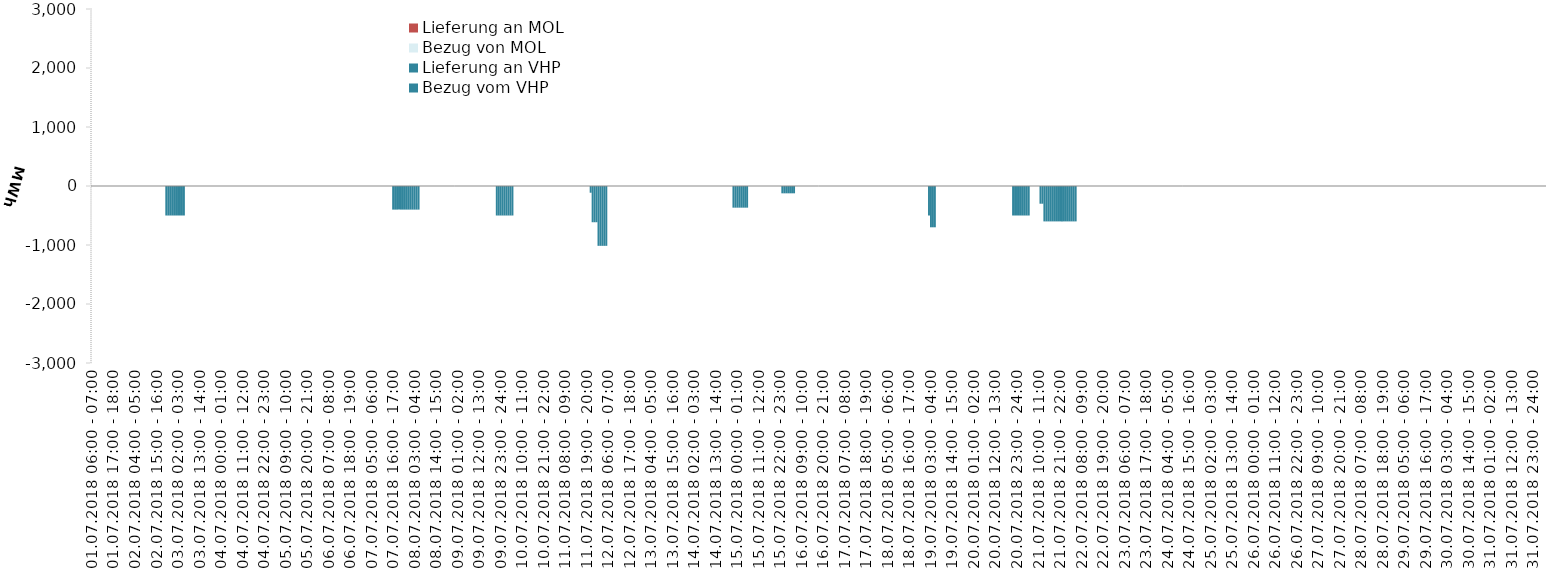
| Category | Bezug vom VHP | Lieferung an VHP | Bezug von MOL | Lieferung an MOL |
|---|---|---|---|---|
| 01.07.2018 06:00 - 07:00 | 0 | 0 | 0 | 0 |
| 01.07.2018 07:00 - 08:00 | 0 | 0 | 0 | 0 |
| 01.07.2018 08:00 - 09:00 | 0 | 0 | 0 | 0 |
| 01.07.2018 09:00 - 10:00 | 0 | 0 | 0 | 0 |
| 01.07.2018 10:00 - 11:00 | 0 | 0 | 0 | 0 |
| 01.07.2018 11:00 - 12:00 | 0 | 0 | 0 | 0 |
| 01.07.2018 12:00 - 13:00 | 0 | 0 | 0 | 0 |
| 01.07.2018 13:00 - 14:00 | 0 | 0 | 0 | 0 |
| 01.07.2018 14:00 - 15:00 | 0 | 0 | 0 | 0 |
| 01.07.2018 15:00 - 16:00 | 0 | 0 | 0 | 0 |
| 01.07.2018 16:00 - 17:00 | 0 | 0 | 0 | 0 |
| 01.07.2018 17:00 - 18:00 | 0 | 0 | 0 | 0 |
| 01.07.2018 18:00 - 19:00 | 0 | 0 | 0 | 0 |
| 01.07.2018 19:00 - 20:00 | 0 | 0 | 0 | 0 |
| 01.07.2018 20:00 - 21:00 | 0 | 0 | 0 | 0 |
| 01.07.2018 21:00 - 22:00 | 0 | 0 | 0 | 0 |
| 01.07.2018 22:00 - 23:00 | 0 | 0 | 0 | 0 |
| 01.07.2018 23:00 - 24:00 | 0 | 0 | 0 | 0 |
| 02.07.2018 00:00 - 01:00 | 0 | 0 | 0 | 0 |
| 02.07.2018 01:00 - 02:00 | 0 | 0 | 0 | 0 |
| 02.07.2018 02:00 - 03:00 | 0 | 0 | 0 | 0 |
| 02.07.2018 03:00 - 04:00 | 0 | 0 | 0 | 0 |
| 02.07.2018 04:00 - 05:00 | 0 | 0 | 0 | 0 |
| 02.07.2018 05:00 - 06:00 | 0 | 0 | 0 | 0 |
| 02.07.2018 06:00 - 07:00 | 0 | 0 | 0 | 0 |
| 02.07.2018 07:00 - 08:00 | 0 | 0 | 0 | 0 |
| 02.07.2018 08:00 - 09:00 | 0 | 0 | 0 | 0 |
| 02.07.2018 09:00 - 10:00 | 0 | 0 | 0 | 0 |
| 02.07.2018 10:00 - 11:00 | 0 | 0 | 0 | 0 |
| 02.07.2018 11:00 - 12:00 | 0 | 0 | 0 | 0 |
| 02.07.2018 12:00 - 13:00 | 0 | 0 | 0 | 0 |
| 02.07.2018 13:00 - 14:00 | 0 | 0 | 0 | 0 |
| 02.07.2018 14:00 - 15:00 | 0 | 0 | 0 | 0 |
| 02.07.2018 15:00 - 16:00 | 0 | 0 | 0 | 0 |
| 02.07.2018 16:00 - 17:00 | 0 | 0 | 0 | 0 |
| 02.07.2018 17:00 - 18:00 | 0 | 0 | 0 | 0 |
| 02.07.2018 18:00 - 19:00 | 0 | 0 | 0 | 0 |
| 02.07.2018 19:00 - 20:00 | 0 | 0 | 0 | 0 |
| 02.07.2018 20:00 - 21:00 | 0 | -500 | 0 | 0 |
| 02.07.2018 21:00 - 22:00 | 0 | -500 | 0 | 0 |
| 02.07.2018 22:00 - 23:00 | 0 | -500 | 0 | 0 |
| 02.07.2018 23:00 - 24:00 | 0 | -500 | 0 | 0 |
| 03.07.2018 00:00 - 01:00 | 0 | -500 | 0 | 0 |
| 03.07.2018 01:00 - 02:00 | 0 | -500 | 0 | 0 |
| 03.07.2018 02:00 - 03:00 | 0 | -500 | 0 | 0 |
| 03.07.2018 03:00 - 04:00 | 0 | -500 | 0 | 0 |
| 03.07.2018 04:00 - 05:00 | 0 | -500 | 0 | 0 |
| 03.07.2018 05:00 - 06:00 | 0 | -500 | 0 | 0 |
| 03.07.2018 06:00 - 07:00 | 0 | 0 | 0 | 0 |
| 03.07.2018 07:00 - 08:00 | 0 | 0 | 0 | 0 |
| 03.07.2018 08:00 - 09:00 | 0 | 0 | 0 | 0 |
| 03.07.2018 09:00 - 10:00 | 0 | 0 | 0 | 0 |
| 03.07.2018 10:00 - 11:00 | 0 | 0 | 0 | 0 |
| 03.07.2018 11:00 - 12:00 | 0 | 0 | 0 | 0 |
| 03.07.2018 12:00 - 13:00 | 0 | 0 | 0 | 0 |
| 03.07.2018 13:00 - 14:00 | 0 | 0 | 0 | 0 |
| 03.07.2018 14:00 - 15:00 | 0 | 0 | 0 | 0 |
| 03.07.2018 15:00 - 16:00 | 0 | 0 | 0 | 0 |
| 03.07.2018 16:00 - 17:00 | 0 | 0 | 0 | 0 |
| 03.07.2018 17:00 - 18:00 | 0 | 0 | 0 | 0 |
| 03.07.2018 18:00 - 19:00 | 0 | 0 | 0 | 0 |
| 03.07.2018 19:00 - 20:00 | 0 | 0 | 0 | 0 |
| 03.07.2018 20:00 - 21:00 | 0 | 0 | 0 | 0 |
| 03.07.2018 21:00 - 22:00 | 0 | 0 | 0 | 0 |
| 03.07.2018 22:00 - 23:00 | 0 | 0 | 0 | 0 |
| 03.07.2018 23:00 - 24:00 | 0 | 0 | 0 | 0 |
| 04.07.2018 00:00 - 01:00 | 0 | 0 | 0 | 0 |
| 04.07.2018 01:00 - 02:00 | 0 | 0 | 0 | 0 |
| 04.07.2018 02:00 - 03:00 | 0 | 0 | 0 | 0 |
| 04.07.2018 03:00 - 04:00 | 0 | 0 | 0 | 0 |
| 04.07.2018 04:00 - 05:00 | 0 | 0 | 0 | 0 |
| 04.07.2018 05:00 - 06:00 | 0 | 0 | 0 | 0 |
| 04.07.2018 06:00 - 07:00 | 0 | 0 | 0 | 0 |
| 04.07.2018 07:00 - 08:00 | 0 | 0 | 0 | 0 |
| 04.07.2018 08:00 - 09:00 | 0 | 0 | 0 | 0 |
| 04.07.2018 09:00 - 10:00 | 0 | 0 | 0 | 0 |
| 04.07.2018 10:00 - 11:00 | 0 | 0 | 0 | 0 |
| 04.07.2018 11:00 - 12:00 | 0 | 0 | 0 | 0 |
| 04.07.2018 12:00 - 13:00 | 0 | 0 | 0 | 0 |
| 04.07.2018 13:00 - 14:00 | 0 | 0 | 0 | 0 |
| 04.07.2018 14:00 - 15:00 | 0 | 0 | 0 | 0 |
| 04.07.2018 15:00 - 16:00 | 0 | 0 | 0 | 0 |
| 04.07.2018 16:00 - 17:00 | 0 | 0 | 0 | 0 |
| 04.07.2018 17:00 - 18:00 | 0 | 0 | 0 | 0 |
| 04.07.2018 18:00 - 19:00 | 0 | 0 | 0 | 0 |
| 04.07.2018 19:00 - 20:00 | 0 | 0 | 0 | 0 |
| 04.07.2018 20:00 - 21:00 | 0 | 0 | 0 | 0 |
| 04.07.2018 21:00 - 22:00 | 0 | 0 | 0 | 0 |
| 04.07.2018 22:00 - 23:00 | 0 | 0 | 0 | 0 |
| 04.07.2018 23:00 - 24:00 | 0 | 0 | 0 | 0 |
| 05.07.2018 00:00 - 01:00 | 0 | 0 | 0 | 0 |
| 05.07.2018 01:00 - 02:00 | 0 | 0 | 0 | 0 |
| 05.07.2018 02:00 - 03:00 | 0 | 0 | 0 | 0 |
| 05.07.2018 03:00 - 04:00 | 0 | 0 | 0 | 0 |
| 05.07.2018 04:00 - 05:00 | 0 | 0 | 0 | 0 |
| 05.07.2018 05:00 - 06:00 | 0 | 0 | 0 | 0 |
| 05.07.2018 06:00 - 07:00 | 0 | 0 | 0 | 0 |
| 05.07.2018 07:00 - 08:00 | 0 | 0 | 0 | 0 |
| 05.07.2018 08:00 - 09:00 | 0 | 0 | 0 | 0 |
| 05.07.2018 09:00 - 10:00 | 0 | 0 | 0 | 0 |
| 05.07.2018 10:00 - 11:00 | 0 | 0 | 0 | 0 |
| 05.07.2018 11:00 - 12:00 | 0 | 0 | 0 | 0 |
| 05.07.2018 12:00 - 13:00 | 0 | 0 | 0 | 0 |
| 05.07.2018 13:00 - 14:00 | 0 | 0 | 0 | 0 |
| 05.07.2018 14:00 - 15:00 | 0 | 0 | 0 | 0 |
| 05.07.2018 15:00 - 16:00 | 0 | 0 | 0 | 0 |
| 05.07.2018 16:00 - 17:00 | 0 | 0 | 0 | 0 |
| 05.07.2018 17:00 - 18:00 | 0 | 0 | 0 | 0 |
| 05.07.2018 18:00 - 19:00 | 0 | 0 | 0 | 0 |
| 05.07.2018 19:00 - 20:00 | 0 | 0 | 0 | 0 |
| 05.07.2018 20:00 - 21:00 | 0 | 0 | 0 | 0 |
| 05.07.2018 21:00 - 22:00 | 0 | 0 | 0 | 0 |
| 05.07.2018 22:00 - 23:00 | 0 | 0 | 0 | 0 |
| 05.07.2018 23:00 - 24:00 | 0 | 0 | 0 | 0 |
| 06.07.2018 00:00 - 01:00 | 0 | 0 | 0 | 0 |
| 06.07.2018 01:00 - 02:00 | 0 | 0 | 0 | 0 |
| 06.07.2018 02:00 - 03:00 | 0 | 0 | 0 | 0 |
| 06.07.2018 03:00 - 04:00 | 0 | 0 | 0 | 0 |
| 06.07.2018 04:00 - 05:00 | 0 | 0 | 0 | 0 |
| 06.07.2018 05:00 - 06:00 | 0 | 0 | 0 | 0 |
| 06.07.2018 06:00 - 07:00 | 0 | 0 | 0 | 0 |
| 06.07.2018 07:00 - 08:00 | 0 | 0 | 0 | 0 |
| 06.07.2018 08:00 - 09:00 | 0 | 0 | 0 | 0 |
| 06.07.2018 09:00 - 10:00 | 0 | 0 | 0 | 0 |
| 06.07.2018 10:00 - 11:00 | 0 | 0 | 0 | 0 |
| 06.07.2018 11:00 - 12:00 | 0 | 0 | 0 | 0 |
| 06.07.2018 12:00 - 13:00 | 0 | 0 | 0 | 0 |
| 06.07.2018 13:00 - 14:00 | 0 | 0 | 0 | 0 |
| 06.07.2018 14:00 - 15:00 | 0 | 0 | 0 | 0 |
| 06.07.2018 15:00 - 16:00 | 0 | 0 | 0 | 0 |
| 06.07.2018 16:00 - 17:00 | 0 | 0 | 0 | 0 |
| 06.07.2018 17:00 - 18:00 | 0 | 0 | 0 | 0 |
| 06.07.2018 18:00 - 19:00 | 0 | 0 | 0 | 0 |
| 06.07.2018 19:00 - 20:00 | 0 | 0 | 0 | 0 |
| 06.07.2018 20:00 - 21:00 | 0 | 0 | 0 | 0 |
| 06.07.2018 21:00 - 22:00 | 0 | 0 | 0 | 0 |
| 06.07.2018 22:00 - 23:00 | 0 | 0 | 0 | 0 |
| 06.07.2018 23:00 - 24:00 | 0 | 0 | 0 | 0 |
| 07.07.2018 00:00 - 01:00 | 0 | 0 | 0 | 0 |
| 07.07.2018 01:00 - 02:00 | 0 | 0 | 0 | 0 |
| 07.07.2018 02:00 - 03:00 | 0 | 0 | 0 | 0 |
| 07.07.2018 03:00 - 04:00 | 0 | 0 | 0 | 0 |
| 07.07.2018 04:00 - 05:00 | 0 | 0 | 0 | 0 |
| 07.07.2018 05:00 - 06:00 | 0 | 0 | 0 | 0 |
| 07.07.2018 06:00 - 07:00 | 0 | 0 | 0 | 0 |
| 07.07.2018 07:00 - 08:00 | 0 | 0 | 0 | 0 |
| 07.07.2018 08:00 - 09:00 | 0 | 0 | 0 | 0 |
| 07.07.2018 09:00 - 10:00 | 0 | 0 | 0 | 0 |
| 07.07.2018 10:00 - 11:00 | 0 | 0 | 0 | 0 |
| 07.07.2018 11:00 - 12:00 | 0 | 0 | 0 | 0 |
| 07.07.2018 12:00 - 13:00 | 0 | 0 | 0 | 0 |
| 07.07.2018 13:00 - 14:00 | 0 | 0 | 0 | 0 |
| 07.07.2018 14:00 - 15:00 | 0 | 0 | 0 | 0 |
| 07.07.2018 15:00 - 16:00 | 0 | 0 | 0 | 0 |
| 07.07.2018 16:00 - 17:00 | 0 | -400 | 0 | 0 |
| 07.07.2018 17:00 - 18:00 | 0 | -400 | 0 | 0 |
| 07.07.2018 18:00 - 19:00 | 0 | -400 | 0 | 0 |
| 07.07.2018 19:00 - 20:00 | 0 | -400 | 0 | 0 |
| 07.07.2018 20:00 - 21:00 | 0 | -400 | 0 | 0 |
| 07.07.2018 21:00 - 22:00 | 0 | -400 | 0 | 0 |
| 07.07.2018 22:00 - 23:00 | 0 | -400 | 0 | 0 |
| 07.07.2018 23:00 - 24:00 | 0 | -400 | 0 | 0 |
| 08.07.2018 00:00 - 01:00 | 0 | -400 | 0 | 0 |
| 08.07.2018 01:00 - 02:00 | 0 | -400 | 0 | 0 |
| 08.07.2018 02:00 - 03:00 | 0 | -400 | 0 | 0 |
| 08.07.2018 03:00 - 04:00 | 0 | -400 | 0 | 0 |
| 08.07.2018 04:00 - 05:00 | 0 | -400 | 0 | 0 |
| 08.07.2018 05:00 - 06:00 | 0 | -400 | 0 | 0 |
| 08.07.2018 06:00 - 07:00 | 0 | 0 | 0 | 0 |
| 08.07.2018 07:00 - 08:00 | 0 | 0 | 0 | 0 |
| 08.07.2018 08:00 - 09:00 | 0 | 0 | 0 | 0 |
| 08.07.2018 09:00 - 10:00 | 0 | 0 | 0 | 0 |
| 08.07.2018 10:00 - 11:00 | 0 | 0 | 0 | 0 |
| 08.07.2018 11:00 - 12:00 | 0 | 0 | 0 | 0 |
| 08.07.2018 12:00 - 13:00 | 0 | 0 | 0 | 0 |
| 08.07.2018 13:00 - 14:00 | 0 | 0 | 0 | 0 |
| 08.07.2018 14:00 - 15:00 | 0 | 0 | 0 | 0 |
| 08.07.2018 15:00 - 16:00 | 0 | 0 | 0 | 0 |
| 08.07.2018 16:00 - 17:00 | 0 | 0 | 0 | 0 |
| 08.07.2018 17:00 - 18:00 | 0 | 0 | 0 | 0 |
| 08.07.2018 18:00 - 19:00 | 0 | 0 | 0 | 0 |
| 08.07.2018 19:00 - 20:00 | 0 | 0 | 0 | 0 |
| 08.07.2018 20:00 - 21:00 | 0 | 0 | 0 | 0 |
| 08.07.2018 21:00 - 22:00 | 0 | 0 | 0 | 0 |
| 08.07.2018 22:00 - 23:00 | 0 | 0 | 0 | 0 |
| 08.07.2018 23:00 - 24:00 | 0 | 0 | 0 | 0 |
| 09.07.2018 00:00 - 01:00 | 0 | 0 | 0 | 0 |
| 09.07.2018 01:00 - 02:00 | 0 | 0 | 0 | 0 |
| 09.07.2018 02:00 - 03:00 | 0 | 0 | 0 | 0 |
| 09.07.2018 03:00 - 04:00 | 0 | 0 | 0 | 0 |
| 09.07.2018 04:00 - 05:00 | 0 | 0 | 0 | 0 |
| 09.07.2018 05:00 - 06:00 | 0 | 0 | 0 | 0 |
| 09.07.2018 06:00 - 07:00 | 0 | 0 | 0 | 0 |
| 09.07.2018 07:00 - 08:00 | 0 | 0 | 0 | 0 |
| 09.07.2018 08:00 - 09:00 | 0 | 0 | 0 | 0 |
| 09.07.2018 09:00 - 10:00 | 0 | 0 | 0 | 0 |
| 09.07.2018 10:00 - 11:00 | 0 | 0 | 0 | 0 |
| 09.07.2018 11:00 - 12:00 | 0 | 0 | 0 | 0 |
| 09.07.2018 12:00 - 13:00 | 0 | 0 | 0 | 0 |
| 09.07.2018 13:00 - 14:00 | 0 | 0 | 0 | 0 |
| 09.07.2018 14:00 - 15:00 | 0 | 0 | 0 | 0 |
| 09.07.2018 15:00 - 16:00 | 0 | 0 | 0 | 0 |
| 09.07.2018 16:00 - 17:00 | 0 | 0 | 0 | 0 |
| 09.07.2018 17:00 - 18:00 | 0 | 0 | 0 | 0 |
| 09.07.2018 18:00 - 19:00 | 0 | 0 | 0 | 0 |
| 09.07.2018 19:00 - 20:00 | 0 | 0 | 0 | 0 |
| 09.07.2018 20:00 - 21:00 | 0 | 0 | 0 | 0 |
| 09.07.2018 21:00 - 22:00 | 0 | -500 | 0 | 0 |
| 09.07.2018 22:00 - 23:00 | 0 | -500 | 0 | 0 |
| 09.07.2018 23:00 - 24:00 | 0 | -500 | 0 | 0 |
| 10.07.2018 00:00 - 01:00 | 0 | -500 | 0 | 0 |
| 10.07.2018 01:00 - 02:00 | 0 | -500 | 0 | 0 |
| 10.07.2018 02:00 - 03:00 | 0 | -500 | 0 | 0 |
| 10.07.2018 03:00 - 04:00 | 0 | -500 | 0 | 0 |
| 10.07.2018 04:00 - 05:00 | 0 | -500 | 0 | 0 |
| 10.07.2018 05:00 - 06:00 | 0 | -500 | 0 | 0 |
| 10.07.2018 06:00 - 07:00 | 0 | 0 | 0 | 0 |
| 10.07.2018 07:00 - 08:00 | 0 | 0 | 0 | 0 |
| 10.07.2018 08:00 - 09:00 | 0 | 0 | 0 | 0 |
| 10.07.2018 09:00 - 10:00 | 0 | 0 | 0 | 0 |
| 10.07.2018 10:00 - 11:00 | 0 | 0 | 0 | 0 |
| 10.07.2018 11:00 - 12:00 | 0 | 0 | 0 | 0 |
| 10.07.2018 12:00 - 13:00 | 0 | 0 | 0 | 0 |
| 10.07.2018 13:00 - 14:00 | 0 | 0 | 0 | 0 |
| 10.07.2018 14:00 - 15:00 | 0 | 0 | 0 | 0 |
| 10.07.2018 15:00 - 16:00 | 0 | 0 | 0 | 0 |
| 10.07.2018 16:00 - 17:00 | 0 | 0 | 0 | 0 |
| 10.07.2018 17:00 - 18:00 | 0 | 0 | 0 | 0 |
| 10.07.2018 18:00 - 19:00 | 0 | 0 | 0 | 0 |
| 10.07.2018 19:00 - 20:00 | 0 | 0 | 0 | 0 |
| 10.07.2018 20:00 - 21:00 | 0 | 0 | 0 | 0 |
| 10.07.2018 21:00 - 22:00 | 0 | 0 | 0 | 0 |
| 10.07.2018 22:00 - 23:00 | 0 | 0 | 0 | 0 |
| 10.07.2018 23:00 - 24:00 | 0 | 0 | 0 | 0 |
| 11.07.2018 00:00 - 01:00 | 0 | 0 | 0 | 0 |
| 11.07.2018 01:00 - 02:00 | 0 | 0 | 0 | 0 |
| 11.07.2018 02:00 - 03:00 | 0 | 0 | 0 | 0 |
| 11.07.2018 03:00 - 04:00 | 0 | 0 | 0 | 0 |
| 11.07.2018 04:00 - 05:00 | 0 | 0 | 0 | 0 |
| 11.07.2018 05:00 - 06:00 | 0 | 0 | 0 | 0 |
| 11.07.2018 06:00 - 07:00 | 0 | 0 | 0 | 0 |
| 11.07.2018 07:00 - 08:00 | 0 | 0 | 0 | 0 |
| 11.07.2018 08:00 - 09:00 | 0 | 0 | 0 | 0 |
| 11.07.2018 09:00 - 10:00 | 0 | 0 | 0 | 0 |
| 11.07.2018 10:00 - 11:00 | 0 | 0 | 0 | 0 |
| 11.07.2018 11:00 - 12:00 | 0 | 0 | 0 | 0 |
| 11.07.2018 12:00 - 13:00 | 0 | 0 | 0 | 0 |
| 11.07.2018 13:00 - 14:00 | 0 | 0 | 0 | 0 |
| 11.07.2018 14:00 - 15:00 | 0 | 0 | 0 | 0 |
| 11.07.2018 15:00 - 16:00 | 0 | 0 | 0 | 0 |
| 11.07.2018 16:00 - 17:00 | 0 | 0 | 0 | 0 |
| 11.07.2018 17:00 - 18:00 | 0 | 0 | 0 | 0 |
| 11.07.2018 18:00 - 19:00 | 0 | 0 | 0 | 0 |
| 11.07.2018 19:00 - 20:00 | 0 | 0 | 0 | 0 |
| 11.07.2018 20:00 - 21:00 | 0 | 0 | 0 | 0 |
| 11.07.2018 21:00 - 22:00 | 0 | -114 | 0 | 0 |
| 11.07.2018 22:00 - 23:00 | 0 | -614 | 0 | 0 |
| 11.07.2018 23:00 - 24:00 | 0 | -614 | 0 | 0 |
| 12.07.2018 00:00 - 01:00 | 0 | -614 | 0 | 0 |
| 12.07.2018 01:00 - 02:00 | 0 | -1014 | 0 | 0 |
| 12.07.2018 02:00 - 03:00 | 0 | -1014 | 0 | 0 |
| 12.07.2018 03:00 - 04:00 | 0 | -1014 | 0 | 0 |
| 12.07.2018 04:00 - 05:00 | 0 | -1014 | 0 | 0 |
| 12.07.2018 05:00 - 06:00 | 0 | -1014 | 0 | 0 |
| 12.07.2018 06:00 - 07:00 | 0 | 0 | 0 | 0 |
| 12.07.2018 07:00 - 08:00 | 0 | 0 | 0 | 0 |
| 12.07.2018 08:00 - 09:00 | 0 | 0 | 0 | 0 |
| 12.07.2018 09:00 - 10:00 | 0 | 0 | 0 | 0 |
| 12.07.2018 10:00 - 11:00 | 0 | 0 | 0 | 0 |
| 12.07.2018 11:00 - 12:00 | 0 | 0 | 0 | 0 |
| 12.07.2018 12:00 - 13:00 | 0 | 0 | 0 | 0 |
| 12.07.2018 13:00 - 14:00 | 0 | 0 | 0 | 0 |
| 12.07.2018 14:00 - 15:00 | 0 | 0 | 0 | 0 |
| 12.07.2018 15:00 - 16:00 | 0 | 0 | 0 | 0 |
| 12.07.2018 16:00 - 17:00 | 0 | 0 | 0 | 0 |
| 12.07.2018 17:00 - 18:00 | 0 | 0 | 0 | 0 |
| 12.07.2018 18:00 - 19:00 | 0 | 0 | 0 | 0 |
| 12.07.2018 19:00 - 20:00 | 0 | 0 | 0 | 0 |
| 12.07.2018 20:00 - 21:00 | 0 | 0 | 0 | 0 |
| 12.07.2018 21:00 - 22:00 | 0 | 0 | 0 | 0 |
| 12.07.2018 22:00 - 23:00 | 0 | 0 | 0 | 0 |
| 12.07.2018 23:00 - 24:00 | 0 | 0 | 0 | 0 |
| 13.07.2018 00:00 - 01:00 | 0 | 0 | 0 | 0 |
| 13.07.2018 01:00 - 02:00 | 0 | 0 | 0 | 0 |
| 13.07.2018 02:00 - 03:00 | 0 | 0 | 0 | 0 |
| 13.07.2018 03:00 - 04:00 | 0 | 0 | 0 | 0 |
| 13.07.2018 04:00 - 05:00 | 0 | 0 | 0 | 0 |
| 13.07.2018 05:00 - 06:00 | 0 | 0 | 0 | 0 |
| 13.07.2018 06:00 - 07:00 | 0 | 0 | 0 | 0 |
| 13.07.2018 07:00 - 08:00 | 0 | 0 | 0 | 0 |
| 13.07.2018 08:00 - 09:00 | 0 | 0 | 0 | 0 |
| 13.07.2018 09:00 - 10:00 | 0 | 0 | 0 | 0 |
| 13.07.2018 10:00 - 11:00 | 0 | 0 | 0 | 0 |
| 13.07.2018 11:00 - 12:00 | 0 | 0 | 0 | 0 |
| 13.07.2018 12:00 - 13:00 | 0 | 0 | 0 | 0 |
| 13.07.2018 13:00 - 14:00 | 0 | 0 | 0 | 0 |
| 13.07.2018 14:00 - 15:00 | 0 | 0 | 0 | 0 |
| 13.07.2018 15:00 - 16:00 | 0 | 0 | 0 | 0 |
| 13.07.2018 16:00 - 17:00 | 0 | 0 | 0 | 0 |
| 13.07.2018 17:00 - 18:00 | 0 | 0 | 0 | 0 |
| 13.07.2018 18:00 - 19:00 | 0 | 0 | 0 | 0 |
| 13.07.2018 19:00 - 20:00 | 0 | 0 | 0 | 0 |
| 13.07.2018 20:00 - 21:00 | 0 | 0 | 0 | 0 |
| 13.07.2018 21:00 - 22:00 | 0 | 0 | 0 | 0 |
| 13.07.2018 22:00 - 23:00 | 0 | 0 | 0 | 0 |
| 13.07.2018 23:00 - 24:00 | 0 | 0 | 0 | 0 |
| 14.07.2018 00:00 - 01:00 | 0 | 0 | 0 | 0 |
| 14.07.2018 01:00 - 02:00 | 0 | 0 | 0 | 0 |
| 14.07.2018 02:00 - 03:00 | 0 | 0 | 0 | 0 |
| 14.07.2018 03:00 - 04:00 | 0 | 0 | 0 | 0 |
| 14.07.2018 04:00 - 05:00 | 0 | 0 | 0 | 0 |
| 14.07.2018 05:00 - 06:00 | 0 | 0 | 0 | 0 |
| 14.07.2018 06:00 - 07:00 | 0 | 0 | 0 | 0 |
| 14.07.2018 07:00 - 08:00 | 0 | 0 | 0 | 0 |
| 14.07.2018 08:00 - 09:00 | 0 | 0 | 0 | 0 |
| 14.07.2018 09:00 - 10:00 | 0 | 0 | 0 | 0 |
| 14.07.2018 10:00 - 11:00 | 0 | 0 | 0 | 0 |
| 14.07.2018 11:00 - 12:00 | 0 | 0 | 0 | 0 |
| 14.07.2018 12:00 - 13:00 | 0 | 0 | 0 | 0 |
| 14.07.2018 13:00 - 14:00 | 0 | 0 | 0 | 0 |
| 14.07.2018 14:00 - 15:00 | 0 | 0 | 0 | 0 |
| 14.07.2018 15:00 - 16:00 | 0 | 0 | 0 | 0 |
| 14.07.2018 16:00 - 17:00 | 0 | 0 | 0 | 0 |
| 14.07.2018 17:00 - 18:00 | 0 | 0 | 0 | 0 |
| 14.07.2018 18:00 - 19:00 | 0 | 0 | 0 | 0 |
| 14.07.2018 19:00 - 20:00 | 0 | 0 | 0 | 0 |
| 14.07.2018 20:00 - 21:00 | 0 | 0 | 0 | 0 |
| 14.07.2018 21:00 - 22:00 | 0 | 0 | 0 | 0 |
| 14.07.2018 22:00 - 23:00 | 0 | -367 | 0 | 0 |
| 14.07.2018 23:00 - 24:00 | 0 | -367 | 0 | 0 |
| 15.07.2018 00:00 - 01:00 | 0 | -367 | 0 | 0 |
| 15.07.2018 01:00 - 02:00 | 0 | -367 | 0 | 0 |
| 15.07.2018 02:00 - 03:00 | 0 | -367 | 0 | 0 |
| 15.07.2018 03:00 - 04:00 | 0 | -367 | 0 | 0 |
| 15.07.2018 04:00 - 05:00 | 0 | -367 | 0 | 0 |
| 15.07.2018 05:00 - 06:00 | 0 | -367 | 0 | 0 |
| 15.07.2018 06:00 - 07:00 | 0 | 0 | 0 | 0 |
| 15.07.2018 07:00 - 08:00 | 0 | 0 | 0 | 0 |
| 15.07.2018 08:00 - 09:00 | 0 | 0 | 0 | 0 |
| 15.07.2018 09:00 - 10:00 | 0 | 0 | 0 | 0 |
| 15.07.2018 10:00 - 11:00 | 0 | 0 | 0 | 0 |
| 15.07.2018 11:00 - 12:00 | 0 | 0 | 0 | 0 |
| 15.07.2018 12:00 - 13:00 | 0 | 0 | 0 | 0 |
| 15.07.2018 13:00 - 14:00 | 0 | 0 | 0 | 0 |
| 15.07.2018 14:00 - 15:00 | 0 | 0 | 0 | 0 |
| 15.07.2018 15:00 - 16:00 | 0 | 0 | 0 | 0 |
| 15.07.2018 16:00 - 17:00 | 0 | 0 | 0 | 0 |
| 15.07.2018 17:00 - 18:00 | 0 | 0 | 0 | 0 |
| 15.07.2018 18:00 - 19:00 | 0 | 0 | 0 | 0 |
| 15.07.2018 19:00 - 20:00 | 0 | 0 | 0 | 0 |
| 15.07.2018 20:00 - 21:00 | 0 | 0 | 0 | 0 |
| 15.07.2018 21:00 - 22:00 | 0 | 0 | 0 | 0 |
| 15.07.2018 22:00 - 23:00 | 0 | 0 | 0 | 0 |
| 15.07.2018 23:00 - 24:00 | 0 | -124 | 0 | 0 |
| 16.07.2018 00:00 - 01:00 | 0 | -124 | 0 | 0 |
| 16.07.2018 01:00 - 02:00 | 0 | -124 | 0 | 0 |
| 16.07.2018 02:00 - 03:00 | 0 | -124 | 0 | 0 |
| 16.07.2018 03:00 - 04:00 | 0 | -124 | 0 | 0 |
| 16.07.2018 04:00 - 05:00 | 0 | -124 | 0 | 0 |
| 16.07.2018 05:00 - 06:00 | 0 | -124 | 0 | 0 |
| 16.07.2018 06:00 - 07:00 | 0 | 0 | 0 | 0 |
| 16.07.2018 07:00 - 08:00 | 0 | 0 | 0 | 0 |
| 16.07.2018 08:00 - 09:00 | 0 | 0 | 0 | 0 |
| 16.07.2018 09:00 - 10:00 | 0 | 0 | 0 | 0 |
| 16.07.2018 10:00 - 11:00 | 0 | 0 | 0 | 0 |
| 16.07.2018 11:00 - 12:00 | 0 | 0 | 0 | 0 |
| 16.07.2018 12:00 - 13:00 | 0 | 0 | 0 | 0 |
| 16.07.2018 13:00 - 14:00 | 0 | 0 | 0 | 0 |
| 16.07.2018 14:00 - 15:00 | 0 | 0 | 0 | 0 |
| 16.07.2018 15:00 - 16:00 | 0 | 0 | 0 | 0 |
| 16.07.2018 16:00 - 17:00 | 0 | 0 | 0 | 0 |
| 16.07.2018 17:00 - 18:00 | 0 | 0 | 0 | 0 |
| 16.07.2018 18:00 - 19:00 | 0 | 0 | 0 | 0 |
| 16.07.2018 19:00 - 20:00 | 0 | 0 | 0 | 0 |
| 16.07.2018 20:00 - 21:00 | 0 | 0 | 0 | 0 |
| 16.07.2018 21:00 - 22:00 | 0 | 0 | 0 | 0 |
| 16.07.2018 22:00 - 23:00 | 0 | 0 | 0 | 0 |
| 16.07.2018 23:00 - 24:00 | 0 | 0 | 0 | 0 |
| 17.07.2018 00:00 - 01:00 | 0 | 0 | 0 | 0 |
| 17.07.2018 01:00 - 02:00 | 0 | 0 | 0 | 0 |
| 17.07.2018 02:00 - 03:00 | 0 | 0 | 0 | 0 |
| 17.07.2018 03:00 - 04:00 | 0 | 0 | 0 | 0 |
| 17.07.2018 04:00 - 05:00 | 0 | 0 | 0 | 0 |
| 17.07.2018 05:00 - 06:00 | 0 | 0 | 0 | 0 |
| 17.07.2018 06:00 - 07:00 | 0 | 0 | 0 | 0 |
| 17.07.2018 07:00 - 08:00 | 0 | 0 | 0 | 0 |
| 17.07.2018 08:00 - 09:00 | 0 | 0 | 0 | 0 |
| 17.07.2018 09:00 - 10:00 | 0 | 0 | 0 | 0 |
| 17.07.2018 10:00 - 11:00 | 0 | 0 | 0 | 0 |
| 17.07.2018 11:00 - 12:00 | 0 | 0 | 0 | 0 |
| 17.07.2018 12:00 - 13:00 | 0 | 0 | 0 | 0 |
| 17.07.2018 13:00 - 14:00 | 0 | 0 | 0 | 0 |
| 17.07.2018 14:00 - 15:00 | 0 | 0 | 0 | 0 |
| 17.07.2018 15:00 - 16:00 | 0 | 0 | 0 | 0 |
| 17.07.2018 16:00 - 17:00 | 0 | 0 | 0 | 0 |
| 17.07.2018 17:00 - 18:00 | 0 | 0 | 0 | 0 |
| 17.07.2018 18:00 - 19:00 | 0 | 0 | 0 | 0 |
| 17.07.2018 19:00 - 20:00 | 0 | 0 | 0 | 0 |
| 17.07.2018 20:00 - 21:00 | 0 | 0 | 0 | 0 |
| 17.07.2018 21:00 - 22:00 | 0 | 0 | 0 | 0 |
| 17.07.2018 22:00 - 23:00 | 0 | 0 | 0 | 0 |
| 17.07.2018 23:00 - 24:00 | 0 | 0 | 0 | 0 |
| 18.07.2018 00:00 - 01:00 | 0 | 0 | 0 | 0 |
| 18.07.2018 01:00 - 02:00 | 0 | 0 | 0 | 0 |
| 18.07.2018 02:00 - 03:00 | 0 | 0 | 0 | 0 |
| 18.07.2018 03:00 - 04:00 | 0 | 0 | 0 | 0 |
| 18.07.2018 04:00 - 05:00 | 0 | 0 | 0 | 0 |
| 18.07.2018 05:00 - 06:00 | 0 | 0 | 0 | 0 |
| 18.07.2018 06:00 - 07:00 | 0 | 0 | 0 | 0 |
| 18.07.2018 07:00 - 08:00 | 0 | 0 | 0 | 0 |
| 18.07.2018 08:00 - 09:00 | 0 | 0 | 0 | 0 |
| 18.07.2018 09:00 - 10:00 | 0 | 0 | 0 | 0 |
| 18.07.2018 10:00 - 11:00 | 0 | 0 | 0 | 0 |
| 18.07.2018 11:00 - 12:00 | 0 | 0 | 0 | 0 |
| 18.07.2018 12:00 - 13:00 | 0 | 0 | 0 | 0 |
| 18.07.2018 13:00 - 14:00 | 0 | 0 | 0 | 0 |
| 18.07.2018 14:00 - 15:00 | 0 | 0 | 0 | 0 |
| 18.07.2018 15:00 - 16:00 | 0 | 0 | 0 | 0 |
| 18.07.2018 16:00 - 17:00 | 0 | 0 | 0 | 0 |
| 18.07.2018 17:00 - 18:00 | 0 | 0 | 0 | 0 |
| 18.07.2018 18:00 - 19:00 | 0 | 0 | 0 | 0 |
| 18.07.2018 19:00 - 20:00 | 0 | 0 | 0 | 0 |
| 18.07.2018 20:00 - 21:00 | 0 | 0 | 0 | 0 |
| 18.07.2018 21:00 - 22:00 | 0 | 0 | 0 | 0 |
| 18.07.2018 22:00 - 23:00 | 0 | 0 | 0 | 0 |
| 18.07.2018 23:00 - 24:00 | 0 | 0 | 0 | 0 |
| 19.07.2018 00:00 - 01:00 | 0 | 0 | 0 | 0 |
| 19.07.2018 01:00 - 02:00 | 0 | 0 | 0 | 0 |
| 19.07.2018 02:00 - 03:00 | 0 | -500 | 0 | 0 |
| 19.07.2018 03:00 - 04:00 | 0 | -700 | 0 | 0 |
| 19.07.2018 04:00 - 05:00 | 0 | -700 | 0 | 0 |
| 19.07.2018 05:00 - 06:00 | 0 | -700 | 0 | 0 |
| 19.07.2018 06:00 - 07:00 | 0 | 0 | 0 | 0 |
| 19.07.2018 07:00 - 08:00 | 0 | 0 | 0 | 0 |
| 19.07.2018 08:00 - 09:00 | 0 | 0 | 0 | 0 |
| 19.07.2018 09:00 - 10:00 | 0 | 0 | 0 | 0 |
| 19.07.2018 10:00 - 11:00 | 0 | 0 | 0 | 0 |
| 19.07.2018 11:00 - 12:00 | 0 | 0 | 0 | 0 |
| 19.07.2018 12:00 - 13:00 | 0 | 0 | 0 | 0 |
| 19.07.2018 13:00 - 14:00 | 0 | 0 | 0 | 0 |
| 19.07.2018 14:00 - 15:00 | 0 | 0 | 0 | 0 |
| 19.07.2018 15:00 - 16:00 | 0 | 0 | 0 | 0 |
| 19.07.2018 16:00 - 17:00 | 0 | 0 | 0 | 0 |
| 19.07.2018 17:00 - 18:00 | 0 | 0 | 0 | 0 |
| 19.07.2018 18:00 - 19:00 | 0 | 0 | 0 | 0 |
| 19.07.2018 19:00 - 20:00 | 0 | 0 | 0 | 0 |
| 19.07.2018 20:00 - 21:00 | 0 | 0 | 0 | 0 |
| 19.07.2018 21:00 - 22:00 | 0 | 0 | 0 | 0 |
| 19.07.2018 22:00 - 23:00 | 0 | 0 | 0 | 0 |
| 19.07.2018 23:00 - 24:00 | 0 | 0 | 0 | 0 |
| 20.07.2018 00:00 - 01:00 | 0 | 0 | 0 | 0 |
| 20.07.2018 01:00 - 02:00 | 0 | 0 | 0 | 0 |
| 20.07.2018 02:00 - 03:00 | 0 | 0 | 0 | 0 |
| 20.07.2018 03:00 - 04:00 | 0 | 0 | 0 | 0 |
| 20.07.2018 04:00 - 05:00 | 0 | 0 | 0 | 0 |
| 20.07.2018 05:00 - 06:00 | 0 | 0 | 0 | 0 |
| 20.07.2018 06:00 - 07:00 | 0 | 0 | 0 | 0 |
| 20.07.2018 07:00 - 08:00 | 0 | 0 | 0 | 0 |
| 20.07.2018 08:00 - 09:00 | 0 | 0 | 0 | 0 |
| 20.07.2018 09:00 - 10:00 | 0 | 0 | 0 | 0 |
| 20.07.2018 10:00 - 11:00 | 0 | 0 | 0 | 0 |
| 20.07.2018 11:00 - 12:00 | 0 | 0 | 0 | 0 |
| 20.07.2018 12:00 - 13:00 | 0 | 0 | 0 | 0 |
| 20.07.2018 13:00 - 14:00 | 0 | 0 | 0 | 0 |
| 20.07.2018 14:00 - 15:00 | 0 | 0 | 0 | 0 |
| 20.07.2018 15:00 - 16:00 | 0 | 0 | 0 | 0 |
| 20.07.2018 16:00 - 17:00 | 0 | 0 | 0 | 0 |
| 20.07.2018 17:00 - 18:00 | 0 | 0 | 0 | 0 |
| 20.07.2018 18:00 - 19:00 | 0 | 0 | 0 | 0 |
| 20.07.2018 19:00 - 20:00 | 0 | 0 | 0 | 0 |
| 20.07.2018 20:00 - 21:00 | 0 | 0 | 0 | 0 |
| 20.07.2018 21:00 - 22:00 | 0 | -500 | 0 | 0 |
| 20.07.2018 22:00 - 23:00 | 0 | -500 | 0 | 0 |
| 20.07.2018 23:00 - 24:00 | 0 | -500 | 0 | 0 |
| 21.07.2018 00:00 - 01:00 | 0 | -500 | 0 | 0 |
| 21.07.2018 01:00 - 02:00 | 0 | -500 | 0 | 0 |
| 21.07.2018 02:00 - 03:00 | 0 | -500 | 0 | 0 |
| 21.07.2018 03:00 - 04:00 | 0 | -500 | 0 | 0 |
| 21.07.2018 04:00 - 05:00 | 0 | -500 | 0 | 0 |
| 21.07.2018 05:00 - 06:00 | 0 | -500 | 0 | 0 |
| 21.07.2018 06:00 - 07:00 | 0 | 0 | 0 | 0 |
| 21.07.2018 07:00 - 08:00 | 0 | 0 | 0 | 0 |
| 21.07.2018 08:00 - 09:00 | 0 | 0 | 0 | 0 |
| 21.07.2018 09:00 - 10:00 | 0 | 0 | 0 | 0 |
| 21.07.2018 10:00 - 11:00 | 0 | 0 | 0 | 0 |
| 21.07.2018 11:00 - 12:00 | 0 | -300 | 0 | 0 |
| 21.07.2018 12:00 - 13:00 | 0 | -300 | 0 | 0 |
| 21.07.2018 13:00 - 14:00 | 0 | -600 | 0 | 0 |
| 21.07.2018 14:00 - 15:00 | 0 | -600 | 0 | 0 |
| 21.07.2018 15:00 - 16:00 | 0 | -600 | 0 | 0 |
| 21.07.2018 16:00 - 17:00 | 0 | -600 | 0 | 0 |
| 21.07.2018 17:00 - 18:00 | 0 | -600 | 0 | 0 |
| 21.07.2018 18:00 - 19:00 | 0 | -600 | 0 | 0 |
| 21.07.2018 19:00 - 20:00 | 0 | -600 | 0 | 0 |
| 21.07.2018 20:00 - 21:00 | 0 | -600 | 0 | 0 |
| 21.07.2018 21:00 - 22:00 | 0 | -600 | 0 | 0 |
| 21.07.2018 22:00 - 23:00 | 0 | -600 | 0 | 0 |
| 21.07.2018 23:00 - 24:00 | 0 | -600 | 0 | 0 |
| 22.07.2018 00:00 - 01:00 | 0 | -600 | 0 | 0 |
| 22.07.2018 01:00 - 02:00 | 0 | -600 | 0 | 0 |
| 22.07.2018 02:00 - 03:00 | 0 | -600 | 0 | 0 |
| 22.07.2018 03:00 - 04:00 | 0 | -600 | 0 | 0 |
| 22.07.2018 04:00 - 05:00 | 0 | -600 | 0 | 0 |
| 22.07.2018 05:00 - 06:00 | 0 | -600 | 0 | 0 |
| 22.07.2018 06:00 - 07:00 | 0 | 0 | 0 | 0 |
| 22.07.2018 07:00 - 08:00 | 0 | 0 | 0 | 0 |
| 22.07.2018 08:00 - 09:00 | 0 | 0 | 0 | 0 |
| 22.07.2018 09:00 - 10:00 | 0 | 0 | 0 | 0 |
| 22.07.2018 10:00 - 11:00 | 0 | 0 | 0 | 0 |
| 22.07.2018 11:00 - 12:00 | 0 | 0 | 0 | 0 |
| 22.07.2018 12:00 - 13:00 | 0 | 0 | 0 | 0 |
| 22.07.2018 13:00 - 14:00 | 0 | 0 | 0 | 0 |
| 22.07.2018 14:00 - 15:00 | 0 | 0 | 0 | 0 |
| 22.07.2018 15:00 - 16:00 | 0 | 0 | 0 | 0 |
| 22.07.2018 16:00 - 17:00 | 0 | 0 | 0 | 0 |
| 22.07.2018 17:00 - 18:00 | 0 | 0 | 0 | 0 |
| 22.07.2018 18:00 - 19:00 | 0 | 0 | 0 | 0 |
| 22.07.2018 19:00 - 20:00 | 0 | 0 | 0 | 0 |
| 22.07.2018 20:00 - 21:00 | 0 | 0 | 0 | 0 |
| 22.07.2018 21:00 - 22:00 | 0 | 0 | 0 | 0 |
| 22.07.2018 22:00 - 23:00 | 0 | 0 | 0 | 0 |
| 22.07.2018 23:00 - 24:00 | 0 | 0 | 0 | 0 |
| 23.07.2018 00:00 - 01:00 | 0 | 0 | 0 | 0 |
| 23.07.2018 01:00 - 02:00 | 0 | 0 | 0 | 0 |
| 23.07.2018 02:00 - 03:00 | 0 | 0 | 0 | 0 |
| 23.07.2018 03:00 - 04:00 | 0 | 0 | 0 | 0 |
| 23.07.2018 04:00 - 05:00 | 0 | 0 | 0 | 0 |
| 23.07.2018 05:00 - 06:00 | 0 | 0 | 0 | 0 |
| 23.07.2018 06:00 - 07:00 | 0 | 0 | 0 | 0 |
| 23.07.2018 07:00 - 08:00 | 0 | 0 | 0 | 0 |
| 23.07.2018 08:00 - 09:00 | 0 | 0 | 0 | 0 |
| 23.07.2018 09:00 - 10:00 | 0 | 0 | 0 | 0 |
| 23.07.2018 10:00 - 11:00 | 0 | 0 | 0 | 0 |
| 23.07.2018 11:00 - 12:00 | 0 | 0 | 0 | 0 |
| 23.07.2018 12:00 - 13:00 | 0 | 0 | 0 | 0 |
| 23.07.2018 13:00 - 14:00 | 0 | 0 | 0 | 0 |
| 23.07.2018 14:00 - 15:00 | 0 | 0 | 0 | 0 |
| 23.07.2018 15:00 - 16:00 | 0 | 0 | 0 | 0 |
| 23.07.2018 16:00 - 17:00 | 0 | 0 | 0 | 0 |
| 23.07.2018 17:00 - 18:00 | 0 | 0 | 0 | 0 |
| 23.07.2018 18:00 - 19:00 | 0 | 0 | 0 | 0 |
| 23.07.2018 19:00 - 20:00 | 0 | 0 | 0 | 0 |
| 23.07.2018 20:00 - 21:00 | 0 | 0 | 0 | 0 |
| 23.07.2018 21:00 - 22:00 | 0 | 0 | 0 | 0 |
| 23.07.2018 22:00 - 23:00 | 0 | 0 | 0 | 0 |
| 23.07.2018 23:00 - 24:00 | 0 | 0 | 0 | 0 |
| 24.07.2018 00:00 - 01:00 | 0 | 0 | 0 | 0 |
| 24.07.2018 01:00 - 02:00 | 0 | 0 | 0 | 0 |
| 24.07.2018 02:00 - 03:00 | 0 | 0 | 0 | 0 |
| 24.07.2018 03:00 - 04:00 | 0 | 0 | 0 | 0 |
| 24.07.2018 04:00 - 05:00 | 0 | 0 | 0 | 0 |
| 24.07.2018 05:00 - 06:00 | 0 | 0 | 0 | 0 |
| 24.07.2018 06:00 - 07:00 | 0 | 0 | 0 | 0 |
| 24.07.2018 07:00 - 08:00 | 0 | 0 | 0 | 0 |
| 24.07.2018 08:00 - 09:00 | 0 | 0 | 0 | 0 |
| 24.07.2018 09:00 - 10:00 | 0 | 0 | 0 | 0 |
| 24.07.2018 10:00 - 11:00 | 0 | 0 | 0 | 0 |
| 24.07.2018 11:00 - 12:00 | 0 | 0 | 0 | 0 |
| 24.07.2018 12:00 - 13:00 | 0 | 0 | 0 | 0 |
| 24.07.2018 13:00 - 14:00 | 0 | 0 | 0 | 0 |
| 24.07.2018 14:00 - 15:00 | 0 | 0 | 0 | 0 |
| 24.07.2018 15:00 - 16:00 | 0 | 0 | 0 | 0 |
| 24.07.2018 16:00 - 17:00 | 0 | 0 | 0 | 0 |
| 24.07.2018 17:00 - 18:00 | 0 | 0 | 0 | 0 |
| 24.07.2018 18:00 - 19:00 | 0 | 0 | 0 | 0 |
| 24.07.2018 19:00 - 20:00 | 0 | 0 | 0 | 0 |
| 24.07.2018 20:00 - 21:00 | 0 | 0 | 0 | 0 |
| 24.07.2018 21:00 - 22:00 | 0 | 0 | 0 | 0 |
| 24.07.2018 22:00 - 23:00 | 0 | 0 | 0 | 0 |
| 24.07.2018 23:00 - 24:00 | 0 | 0 | 0 | 0 |
| 25.07.2018 00:00 - 01:00 | 0 | 0 | 0 | 0 |
| 25.07.2018 01:00 - 02:00 | 0 | 0 | 0 | 0 |
| 25.07.2018 02:00 - 03:00 | 0 | 0 | 0 | 0 |
| 25.07.2018 03:00 - 04:00 | 0 | 0 | 0 | 0 |
| 25.07.2018 04:00 - 05:00 | 0 | 0 | 0 | 0 |
| 25.07.2018 05:00 - 06:00 | 0 | 0 | 0 | 0 |
| 25.07.2018 06:00 - 07:00 | 0 | 0 | 0 | 0 |
| 25.07.2018 07:00 - 08:00 | 0 | 0 | 0 | 0 |
| 25.07.2018 08:00 - 09:00 | 0 | 0 | 0 | 0 |
| 25.07.2018 09:00 - 10:00 | 0 | 0 | 0 | 0 |
| 25.07.2018 10:00 - 11:00 | 0 | 0 | 0 | 0 |
| 25.07.2018 11:00 - 12:00 | 0 | 0 | 0 | 0 |
| 25.07.2018 12:00 - 13:00 | 0 | 0 | 0 | 0 |
| 25.07.2018 13:00 - 14:00 | 0 | 0 | 0 | 0 |
| 25.07.2018 14:00 - 15:00 | 0 | 0 | 0 | 0 |
| 25.07.2018 15:00 - 16:00 | 0 | 0 | 0 | 0 |
| 25.07.2018 16:00 - 17:00 | 0 | 0 | 0 | 0 |
| 25.07.2018 17:00 - 18:00 | 0 | 0 | 0 | 0 |
| 25.07.2018 18:00 - 19:00 | 0 | 0 | 0 | 0 |
| 25.07.2018 19:00 - 20:00 | 0 | 0 | 0 | 0 |
| 25.07.2018 20:00 - 21:00 | 0 | 0 | 0 | 0 |
| 25.07.2018 21:00 - 22:00 | 0 | 0 | 0 | 0 |
| 25.07.2018 22:00 - 23:00 | 0 | 0 | 0 | 0 |
| 25.07.2018 23:00 - 24:00 | 0 | 0 | 0 | 0 |
| 26.07.2018 00:00 - 01:00 | 0 | 0 | 0 | 0 |
| 26.07.2018 01:00 - 02:00 | 0 | 0 | 0 | 0 |
| 26.07.2018 02:00 - 03:00 | 0 | 0 | 0 | 0 |
| 26.07.2018 03:00 - 04:00 | 0 | 0 | 0 | 0 |
| 26.07.2018 04:00 - 05:00 | 0 | 0 | 0 | 0 |
| 26.07.2018 05:00 - 06:00 | 0 | 0 | 0 | 0 |
| 26.07.2018 06:00 - 07:00 | 0 | 0 | 0 | 0 |
| 26.07.2018 07:00 - 08:00 | 0 | 0 | 0 | 0 |
| 26.07.2018 08:00 - 09:00 | 0 | 0 | 0 | 0 |
| 26.07.2018 09:00 - 10:00 | 0 | 0 | 0 | 0 |
| 26.07.2018 10:00 - 11:00 | 0 | 0 | 0 | 0 |
| 26.07.2018 11:00 - 12:00 | 0 | 0 | 0 | 0 |
| 26.07.2018 12:00 - 13:00 | 0 | 0 | 0 | 0 |
| 26.07.2018 13:00 - 14:00 | 0 | 0 | 0 | 0 |
| 26.07.2018 14:00 - 15:00 | 0 | 0 | 0 | 0 |
| 26.07.2018 15:00 - 16:00 | 0 | 0 | 0 | 0 |
| 26.07.2018 16:00 - 17:00 | 0 | 0 | 0 | 0 |
| 26.07.2018 17:00 - 18:00 | 0 | 0 | 0 | 0 |
| 26.07.2018 18:00 - 19:00 | 0 | 0 | 0 | 0 |
| 26.07.2018 19:00 - 20:00 | 0 | 0 | 0 | 0 |
| 26.07.2018 20:00 - 21:00 | 0 | 0 | 0 | 0 |
| 26.07.2018 21:00 - 22:00 | 0 | 0 | 0 | 0 |
| 26.07.2018 22:00 - 23:00 | 0 | 0 | 0 | 0 |
| 26.07.2018 23:00 - 24:00 | 0 | 0 | 0 | 0 |
| 27.07.2018 00:00 - 01:00 | 0 | 0 | 0 | 0 |
| 27.07.2018 01:00 - 02:00 | 0 | 0 | 0 | 0 |
| 27.07.2018 02:00 - 03:00 | 0 | 0 | 0 | 0 |
| 27.07.2018 03:00 - 04:00 | 0 | 0 | 0 | 0 |
| 27.07.2018 04:00 - 05:00 | 0 | 0 | 0 | 0 |
| 27.07.2018 05:00 - 06:00 | 0 | 0 | 0 | 0 |
| 27.07.2018 06:00 - 07:00 | 0 | 0 | 0 | 0 |
| 27.07.2018 07:00 - 08:00 | 0 | 0 | 0 | 0 |
| 27.07.2018 08:00 - 09:00 | 0 | 0 | 0 | 0 |
| 27.07.2018 09:00 - 10:00 | 0 | 0 | 0 | 0 |
| 27.07.2018 10:00 - 11:00 | 0 | 0 | 0 | 0 |
| 27.07.2018 11:00 - 12:00 | 0 | 0 | 0 | 0 |
| 27.07.2018 12:00 - 13:00 | 0 | 0 | 0 | 0 |
| 27.07.2018 13:00 - 14:00 | 0 | 0 | 0 | 0 |
| 27.07.2018 14:00 - 15:00 | 0 | 0 | 0 | 0 |
| 27.07.2018 15:00 - 16:00 | 0 | 0 | 0 | 0 |
| 27.07.2018 16:00 - 17:00 | 0 | 0 | 0 | 0 |
| 27.07.2018 17:00 - 18:00 | 0 | 0 | 0 | 0 |
| 27.07.2018 18:00 - 19:00 | 0 | 0 | 0 | 0 |
| 27.07.2018 19:00 - 20:00 | 0 | 0 | 0 | 0 |
| 27.07.2018 20:00 - 21:00 | 0 | 0 | 0 | 0 |
| 27.07.2018 21:00 - 22:00 | 0 | 0 | 0 | 0 |
| 27.07.2018 22:00 - 23:00 | 0 | 0 | 0 | 0 |
| 27.07.2018 23:00 - 24:00 | 0 | 0 | 0 | 0 |
| 28.07.2018 00:00 - 01:00 | 0 | 0 | 0 | 0 |
| 28.07.2018 01:00 - 02:00 | 0 | 0 | 0 | 0 |
| 28.07.2018 02:00 - 03:00 | 0 | 0 | 0 | 0 |
| 28.07.2018 03:00 - 04:00 | 0 | 0 | 0 | 0 |
| 28.07.2018 04:00 - 05:00 | 0 | 0 | 0 | 0 |
| 28.07.2018 05:00 - 06:00 | 0 | 0 | 0 | 0 |
| 28.07.2018 06:00 - 07:00 | 0 | 0 | 0 | 0 |
| 28.07.2018 07:00 - 08:00 | 0 | 0 | 0 | 0 |
| 28.07.2018 08:00 - 09:00 | 0 | 0 | 0 | 0 |
| 28.07.2018 09:00 - 10:00 | 0 | 0 | 0 | 0 |
| 28.07.2018 10:00 - 11:00 | 0 | 0 | 0 | 0 |
| 28.07.2018 11:00 - 12:00 | 0 | 0 | 0 | 0 |
| 28.07.2018 12:00 - 13:00 | 0 | 0 | 0 | 0 |
| 28.07.2018 13:00 - 14:00 | 0 | 0 | 0 | 0 |
| 28.07.2018 14:00 - 15:00 | 0 | 0 | 0 | 0 |
| 28.07.2018 15:00 - 16:00 | 0 | 0 | 0 | 0 |
| 28.07.2018 16:00 - 17:00 | 0 | 0 | 0 | 0 |
| 28.07.2018 17:00 - 18:00 | 0 | 0 | 0 | 0 |
| 28.07.2018 18:00 - 19:00 | 0 | 0 | 0 | 0 |
| 28.07.2018 19:00 - 20:00 | 0 | 0 | 0 | 0 |
| 28.07.2018 20:00 - 21:00 | 0 | 0 | 0 | 0 |
| 28.07.2018 21:00 - 22:00 | 0 | 0 | 0 | 0 |
| 28.07.2018 22:00 - 23:00 | 0 | 0 | 0 | 0 |
| 28.07.2018 23:00 - 24:00 | 0 | 0 | 0 | 0 |
| 29.07.2018 00:00 - 01:00 | 0 | 0 | 0 | 0 |
| 29.07.2018 01:00 - 02:00 | 0 | 0 | 0 | 0 |
| 29.07.2018 02:00 - 03:00 | 0 | 0 | 0 | 0 |
| 29.07.2018 03:00 - 04:00 | 0 | 0 | 0 | 0 |
| 29.07.2018 04:00 - 05:00 | 0 | 0 | 0 | 0 |
| 29.07.2018 05:00 - 06:00 | 0 | 0 | 0 | 0 |
| 29.07.2018 06:00 - 07:00 | 0 | 0 | 0 | 0 |
| 29.07.2018 07:00 - 08:00 | 0 | 0 | 0 | 0 |
| 29.07.2018 08:00 - 09:00 | 0 | 0 | 0 | 0 |
| 29.07.2018 09:00 - 10:00 | 0 | 0 | 0 | 0 |
| 29.07.2018 10:00 - 11:00 | 0 | 0 | 0 | 0 |
| 29.07.2018 11:00 - 12:00 | 0 | 0 | 0 | 0 |
| 29.07.2018 12:00 - 13:00 | 0 | 0 | 0 | 0 |
| 29.07.2018 13:00 - 14:00 | 0 | 0 | 0 | 0 |
| 29.07.2018 14:00 - 15:00 | 0 | 0 | 0 | 0 |
| 29.07.2018 15:00 - 16:00 | 0 | 0 | 0 | 0 |
| 29.07.2018 16:00 - 17:00 | 0 | 0 | 0 | 0 |
| 29.07.2018 17:00 - 18:00 | 0 | 0 | 0 | 0 |
| 29.07.2018 18:00 - 19:00 | 0 | 0 | 0 | 0 |
| 29.07.2018 19:00 - 20:00 | 0 | 0 | 0 | 0 |
| 29.07.2018 20:00 - 21:00 | 0 | 0 | 0 | 0 |
| 29.07.2018 21:00 - 22:00 | 0 | 0 | 0 | 0 |
| 29.07.2018 22:00 - 23:00 | 0 | 0 | 0 | 0 |
| 29.07.2018 23:00 - 24:00 | 0 | 0 | 0 | 0 |
| 30.07.2018 00:00 - 01:00 | 0 | 0 | 0 | 0 |
| 30.07.2018 01:00 - 02:00 | 0 | 0 | 0 | 0 |
| 30.07.2018 02:00 - 03:00 | 0 | 0 | 0 | 0 |
| 30.07.2018 03:00 - 04:00 | 0 | 0 | 0 | 0 |
| 30.07.2018 04:00 - 05:00 | 0 | 0 | 0 | 0 |
| 30.07.2018 05:00 - 06:00 | 0 | 0 | 0 | 0 |
| 30.07.2018 06:00 - 07:00 | 0 | 0 | 0 | 0 |
| 30.07.2018 07:00 - 08:00 | 0 | 0 | 0 | 0 |
| 30.07.2018 08:00 - 09:00 | 0 | 0 | 0 | 0 |
| 30.07.2018 09:00 - 10:00 | 0 | 0 | 0 | 0 |
| 30.07.2018 10:00 - 11:00 | 0 | 0 | 0 | 0 |
| 30.07.2018 11:00 - 12:00 | 0 | 0 | 0 | 0 |
| 30.07.2018 12:00 - 13:00 | 0 | 0 | 0 | 0 |
| 30.07.2018 13:00 - 14:00 | 0 | 0 | 0 | 0 |
| 30.07.2018 14:00 - 15:00 | 0 | 0 | 0 | 0 |
| 30.07.2018 15:00 - 16:00 | 0 | 0 | 0 | 0 |
| 30.07.2018 16:00 - 17:00 | 0 | 0 | 0 | 0 |
| 30.07.2018 17:00 - 18:00 | 0 | 0 | 0 | 0 |
| 30.07.2018 18:00 - 19:00 | 0 | 0 | 0 | 0 |
| 30.07.2018 19:00 - 20:00 | 0 | 0 | 0 | 0 |
| 30.07.2018 20:00 - 21:00 | 0 | 0 | 0 | 0 |
| 30.07.2018 21:00 - 22:00 | 0 | 0 | 0 | 0 |
| 30.07.2018 22:00 - 23:00 | 0 | 0 | 0 | 0 |
| 30.07.2018 23:00 - 24:00 | 0 | 0 | 0 | 0 |
| 31.07.2018 00:00 - 01:00 | 0 | 0 | 0 | 0 |
| 31.07.2018 01:00 - 02:00 | 0 | 0 | 0 | 0 |
| 31.07.2018 02:00 - 03:00 | 0 | 0 | 0 | 0 |
| 31.07.2018 03:00 - 04:00 | 0 | 0 | 0 | 0 |
| 31.07.2018 04:00 - 05:00 | 0 | 0 | 0 | 0 |
| 31.07.2018 05:00 - 06:00 | 0 | 0 | 0 | 0 |
| 31.07.2018 06:00 - 07:00 | 0 | 0 | 0 | 0 |
| 31.07.2018 07:00 - 08:00 | 0 | 0 | 0 | 0 |
| 31.07.2018 08:00 - 09:00 | 0 | 0 | 0 | 0 |
| 31.07.2018 09:00 - 10:00 | 0 | 0 | 0 | 0 |
| 31.07.2018 10:00 - 11:00 | 0 | 0 | 0 | 0 |
| 31.07.2018 11:00 - 12:00 | 0 | 0 | 0 | 0 |
| 31.07.2018 12:00 - 13:00 | 0 | 0 | 0 | 0 |
| 31.07.2018 13:00 - 14:00 | 0 | 0 | 0 | 0 |
| 31.07.2018 14:00 - 15:00 | 0 | 0 | 0 | 0 |
| 31.07.2018 15:00 - 16:00 | 0 | 0 | 0 | 0 |
| 31.07.2018 16:00 - 17:00 | 0 | 0 | 0 | 0 |
| 31.07.2018 17:00 - 18:00 | 0 | 0 | 0 | 0 |
| 31.07.2018 18:00 - 19:00 | 0 | 0 | 0 | 0 |
| 31.07.2018 19:00 - 20:00 | 0 | 0 | 0 | 0 |
| 31.07.2018 20:00 - 21:00 | 0 | 0 | 0 | 0 |
| 31.07.2018 21:00 - 22:00 | 0 | 0 | 0 | 0 |
| 31.07.2018 22:00 - 23:00 | 0 | 0 | 0 | 0 |
| 31.07.2018 23:00 - 24:00 | 0 | 0 | 0 | 0 |
| 01.08.2018 00:00 - 01:00 | 0 | 0 | 0 | 0 |
| 01.08.2018 01:00 - 02:00 | 0 | 0 | 0 | 0 |
| 01.08.2018 02:00 - 03:00 | 0 | 0 | 0 | 0 |
| 01.08.2018 03:00 - 04:00 | 0 | 0 | 0 | 0 |
| 01.08.2018 04:00 - 05:00 | 0 | 0 | 0 | 0 |
| 01.08.2018 05:00 - 06:00 | 0 | 0 | 0 | 0 |